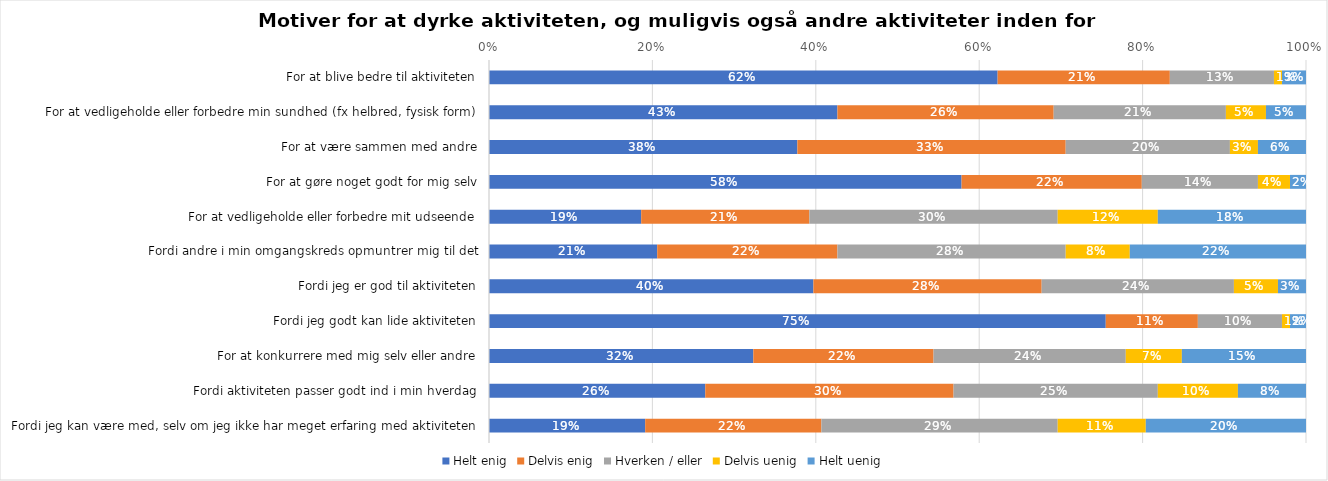
| Category | Helt enig | Delvis enig | Hverken / eller | Delvis uenig | Helt uenig |
|---|---|---|---|---|---|
| For at blive bedre til aktiviteten | 0.623 | 0.211 | 0.127 | 0.01 | 0.029 |
| For at vedligeholde eller forbedre min sundhed (fx helbred, fysisk form) | 0.426 | 0.265 | 0.211 | 0.049 | 0.049 |
| For at være sammen med andre | 0.377 | 0.328 | 0.201 | 0.034 | 0.059 |
| For at gøre noget godt for mig selv | 0.578 | 0.221 | 0.142 | 0.039 | 0.02 |
| For at vedligeholde eller forbedre mit udseende | 0.186 | 0.206 | 0.304 | 0.123 | 0.181 |
| Fordi andre i min omgangskreds opmuntrer mig til det | 0.206 | 0.221 | 0.279 | 0.078 | 0.216 |
| Fordi jeg er god til aktiviteten | 0.397 | 0.279 | 0.235 | 0.054 | 0.034 |
| Fordi jeg godt kan lide aktiviteten | 0.755 | 0.113 | 0.103 | 0.01 | 0.02 |
| For at konkurrere med mig selv eller andre | 0.324 | 0.221 | 0.235 | 0.069 | 0.152 |
| Fordi aktiviteten passer godt ind i min hverdag | 0.265 | 0.304 | 0.25 | 0.098 | 0.083 |
| Fordi jeg kan være med, selv om jeg ikke har meget erfaring med aktiviteten | 0.191 | 0.216 | 0.289 | 0.108 | 0.196 |